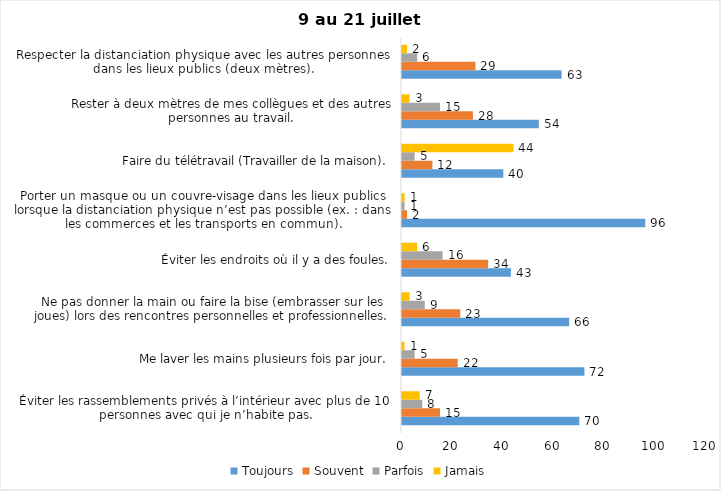
| Category | Toujours | Souvent | Parfois | Jamais |
|---|---|---|---|---|
| Éviter les rassemblements privés à l’intérieur avec plus de 10 personnes avec qui je n’habite pas. | 70 | 15 | 8 | 7 |
| Me laver les mains plusieurs fois par jour. | 72 | 22 | 5 | 1 |
| Ne pas donner la main ou faire la bise (embrasser sur les joues) lors des rencontres personnelles et professionnelles. | 66 | 23 | 9 | 3 |
| Éviter les endroits où il y a des foules. | 43 | 34 | 16 | 6 |
| Porter un masque ou un couvre-visage dans les lieux publics lorsque la distanciation physique n’est pas possible (ex. : dans les commerces et les transports en commun). | 96 | 2 | 1 | 1 |
| Faire du télétravail (Travailler de la maison). | 40 | 12 | 5 | 44 |
| Rester à deux mètres de mes collègues et des autres personnes au travail. | 54 | 28 | 15 | 3 |
| Respecter la distanciation physique avec les autres personnes dans les lieux publics (deux mètres). | 63 | 29 | 6 | 2 |